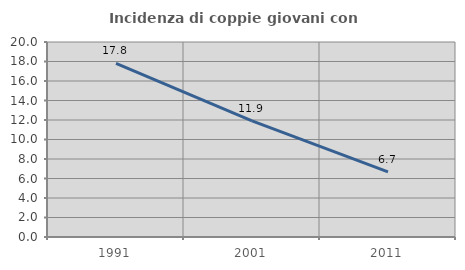
| Category | Incidenza di coppie giovani con figli |
|---|---|
| 1991.0 | 17.811 |
| 2001.0 | 11.906 |
| 2011.0 | 6.683 |